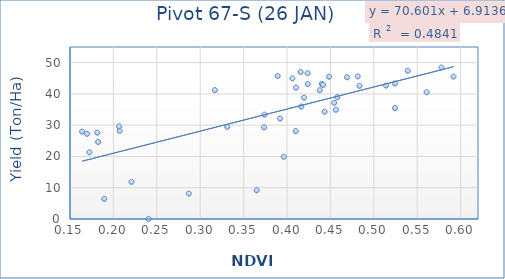
| Category | Series 0 |
|---|---|
| 0.410363 | 42 |
| 0.437707 | 41.17 |
| 0.469096 | 45.3 |
| 0.365068 | 9.2 |
| 0.189456 | 6.43 |
| 0.439995 | 43.2 |
| 0.483459 | 42.57 |
| 0.4101 | 28.1 |
| 0.577868 | 48.45 |
| 0.524421 | 35.45 |
| 0.181448 | 27.6 |
| 0.163981 | 27.95 |
| 0.207193 | 28.18 |
| 0.415593 | 47.01 |
| 0.458011 | 38.97 |
| 0.591776 | 45.55 |
| 0.539065 | 47.39 |
| 0.560831 | 40.53 |
| 0.441432 | 42.88 |
| 0.374054 | 33.37 |
| 0.172358 | 21.32 |
| 0.373583 | 29.32 |
| 0.44333 | 34.3 |
| 0.514082 | 42.66 |
| 0.454348 | 37.14 |
| 0.448337 | 45.5 |
| 0.389237 | 45.73 |
| 0.18237 | 24.63 |
| 0.416451 | 35.94 |
| 0.240612 | 0 |
| 0.406216 | 44.95 |
| 0.423872 | 43.14 |
| 0.45624 | 34.92 |
| 0.396297 | 19.89 |
| 0.423734 | 46.62 |
| 0.419618 | 38.79 |
| 0.481432 | 45.58 |
| 0.39204 | 32.13 |
| 0.169593 | 27.24 |
| 0.220877 | 11.89 |
| 0.316851 | 41.2 |
| 0.206436 | 29.61 |
| 0.524187 | 43.35 |
| 0.331166 | 29.42 |
| 0.28685 | 8.13 |